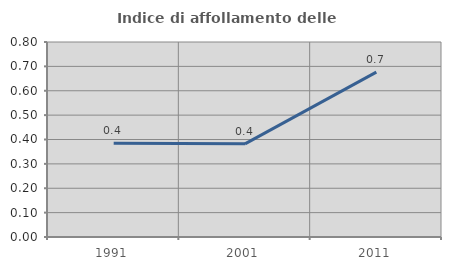
| Category | Indice di affollamento delle abitazioni  |
|---|---|
| 1991.0 | 0.384 |
| 2001.0 | 0.382 |
| 2011.0 | 0.677 |